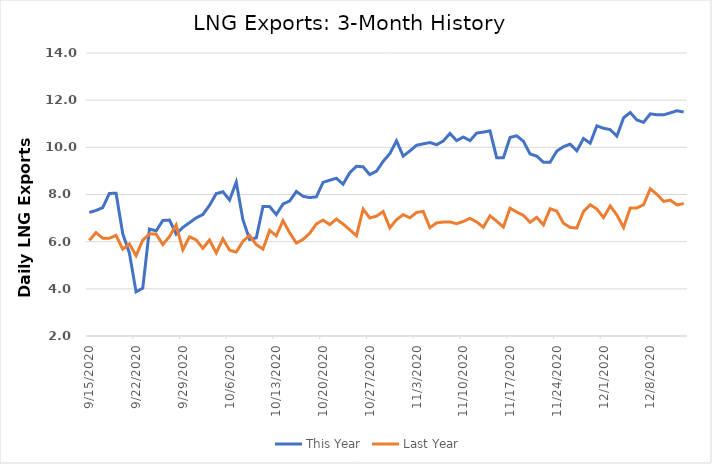
| Category | This Year | Last Year |
|---|---|---|
| 9/15/20 | 7.24 | 6.058 |
| 9/16/20 | 7.323 | 6.386 |
| 9/17/20 | 7.442 | 6.144 |
| 9/18/20 | 8.044 | 6.144 |
| 9/19/20 | 8.056 | 6.266 |
| 9/20/20 | 6.342 | 5.684 |
| 9/21/20 | 5.513 | 5.906 |
| 9/22/20 | 3.87 | 5.408 |
| 9/23/20 | 4.029 | 6.065 |
| 9/24/20 | 6.536 | 6.324 |
| 9/25/20 | 6.459 | 6.325 |
| 9/26/20 | 6.897 | 5.876 |
| 9/27/20 | 6.917 | 6.218 |
| 9/28/20 | 6.322 | 6.708 |
| 9/29/20 | 6.605 | 5.66 |
| 9/30/20 | 6.805 | 6.207 |
| 10/1/20 | 7.011 | 6.073 |
| 10/2/20 | 7.149 | 5.718 |
| 10/3/20 | 7.541 | 6.07 |
| 10/4/20 | 8.035 | 5.525 |
| 10/5/20 | 8.117 | 6.12 |
| 10/6/20 | 7.765 | 5.639 |
| 10/7/20 | 8.527 | 5.558 |
| 10/8/20 | 6.928 | 6.016 |
| 10/9/20 | 6.092 | 6.265 |
| 10/10/20 | 6.161 | 5.877 |
| 10/11/20 | 7.489 | 5.683 |
| 10/12/20 | 7.489 | 6.478 |
| 10/13/20 | 7.149 | 6.25 |
| 10/14/20 | 7.598 | 6.889 |
| 10/15/20 | 7.725 | 6.376 |
| 10/16/20 | 8.129 | 5.941 |
| 10/17/20 | 7.923 | 6.096 |
| 10/18/20 | 7.868 | 6.356 |
| 10/19/20 | 7.903 | 6.755 |
| 10/20/20 | 8.515 | 6.916 |
| 10/21/20 | 8.606 | 6.724 |
| 10/22/20 | 8.687 | 6.957 |
| 10/23/20 | 8.437 | 6.748 |
| 10/24/20 | 8.925 | 6.504 |
| 10/25/20 | 9.197 | 6.252 |
| 10/26/20 | 9.173 | 7.381 |
| 10/27/20 | 8.843 | 7.003 |
| 10/28/20 | 8.988 | 7.082 |
| 10/29/20 | 9.404 | 7.277 |
| 10/30/20 | 9.735 | 6.586 |
| 10/31/20 | 10.274 | 6.934 |
| 11/1/20 | 9.627 | 7.144 |
| 11/2/20 | 9.848 | 7.013 |
| 11/3/20 | 10.087 | 7.238 |
| 11/4/20 | 10.149 | 7.283 |
| 11/5/20 | 10.203 | 6.592 |
| 11/6/20 | 10.11 | 6.797 |
| 11/7/20 | 10.268 | 6.831 |
| 11/8/20 | 10.587 | 6.839 |
| 11/9/20 | 10.284 | 6.763 |
| 11/10/20 | 10.436 | 6.857 |
| 11/11/20 | 10.285 | 6.988 |
| 11/12/20 | 10.603 | 6.838 |
| 11/13/20 | 10.646 | 6.611 |
| 11/14/20 | 10.698 | 7.095 |
| 11/15/20 | 9.556 | 6.868 |
| 11/16/20 | 9.555 | 6.62 |
| 11/17/20 | 10.421 | 7.42 |
| 11/18/20 | 10.487 | 7.256 |
| 11/19/20 | 10.26 | 7.118 |
| 11/20/20 | 9.717 | 6.821 |
| 11/21/20 | 9.629 | 7.031 |
| 11/22/20 | 9.369 | 6.709 |
| 11/23/20 | 9.369 | 7.397 |
| 11/24/20 | 9.839 | 7.294 |
| 11/25/20 | 10.03 | 6.782 |
| 11/26/20 | 10.134 | 6.605 |
| 11/27/20 | 9.85 | 6.579 |
| 11/28/20 | 10.375 | 7.278 |
| 11/29/20 | 10.175 | 7.567 |
| 11/30/20 | 10.909 | 7.384 |
| 12/1/20 | 10.808 | 7.021 |
| 12/2/20 | 10.752 | 7.515 |
| 12/3/20 | 10.471 | 7.13 |
| 12/4/20 | 11.251 | 6.601 |
| 12/5/20 | 11.478 | 7.428 |
| 12/6/20 | 11.158 | 7.43 |
| 12/7/20 | 11.061 | 7.568 |
| 12/8/20 | 11.419 | 8.24 |
| 12/9/20 | 11.381 | 8.004 |
| 12/10/20 | 11.376 | 7.708 |
| 12/11/20 | 11.462 | 7.761 |
| 12/12/20 | 11.551 | 7.556 |
| 12/13/20 | 11.498 | 7.619 |